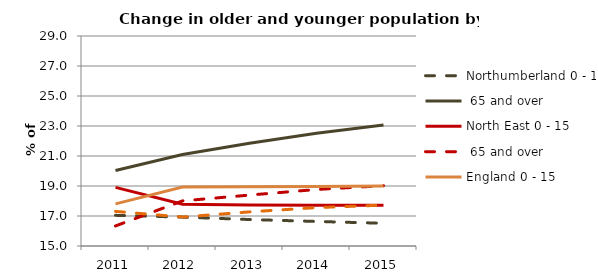
| Category | Northumberland 0 - 15 | Northumberland 65 and over | North East 0 - 15 | North East 65 and over | England 0 - 15 | England 65 and over |
|---|---|---|---|---|---|---|
| 2011.0 | 17.045 | 20.031 | 18.907 | 16.337 | 17.807 | 17.309 |
| 2012.0 | 16.925 | 21.101 | 17.78 | 18.007 | 18.937 | 16.93 |
| 2013.0 | 16.765 | 21.848 | 17.729 | 18.396 | 18.953 | 17.275 |
| 2014.0 | 16.637 | 22.515 | 17.713 | 18.768 | 18.969 | 17.559 |
| 2015.0 | 16.514 | 23.067 | 17.717 | 19.02 | 18.992 | 17.726 |